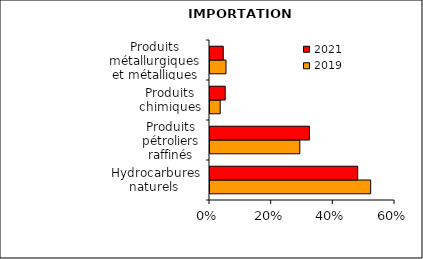
| Category | 2019 | 2021 |
|---|---|---|
| Hydrocarbures naturels  | 0.521 | 0.479 |
| Produits pétroliers raffinés | 0.291 | 0.323 |
| Produits chimiques | 0.033 | 0.049 |
| Produits métallurgiques et métalliques | 0.052 | 0.043 |